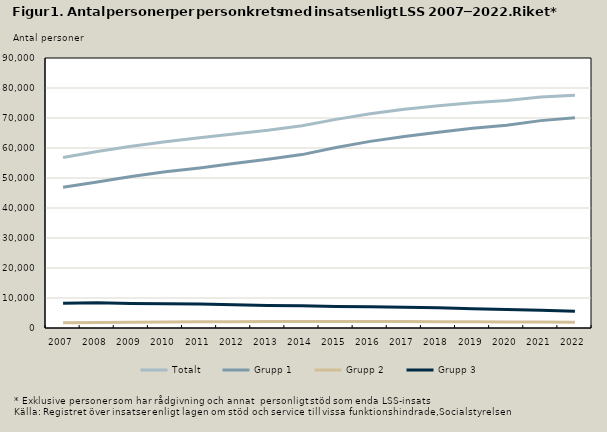
| Category | Totalt | Grupp 1 | Grupp 2 | Grupp 3 |
|---|---|---|---|---|
| 2007.0 | 56861 | 46888 | 1721 | 8252 |
| 2008.0 | 58825 | 48634 | 1809 | 8382 |
| 2009.0 | 60588 | 50529 | 1892 | 8167 |
| 2010.0 | 62096 | 52073 | 1975 | 8048 |
| 2011.0 | 63405 | 53341 | 2052 | 8012 |
| 2012.0 | 64655 | 54836 | 2104 | 7715 |
| 2013.0 | 65884 | 56225 | 2129 | 7530 |
| 2014.0 | 67397 | 57802 | 2168 | 7427 |
| 2015.0 | 69541 | 60185 | 2171 | 7185 |
| 2016.0 | 71432 | 62211 | 2133 | 7088 |
| 2017.0 | 72912 | 63828 | 2168 | 6916 |
| 2018.0 | 74087 | 65275 | 2095 | 6717 |
| 2019.0 | 75087 | 66546 | 2089 | 6452 |
| 2020.0 | 75801 | 67575 | 2024 | 6202 |
| 2021.0 | 76967 | 69124 | 1961 | 5882 |
| 2022.0 | 77546 | 70049 | 1899 | 5598 |